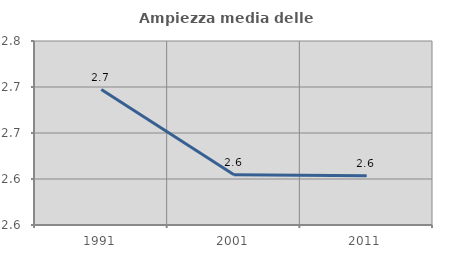
| Category | Ampiezza media delle famiglie |
|---|---|
| 1991.0 | 2.697 |
| 2001.0 | 2.605 |
| 2011.0 | 2.603 |